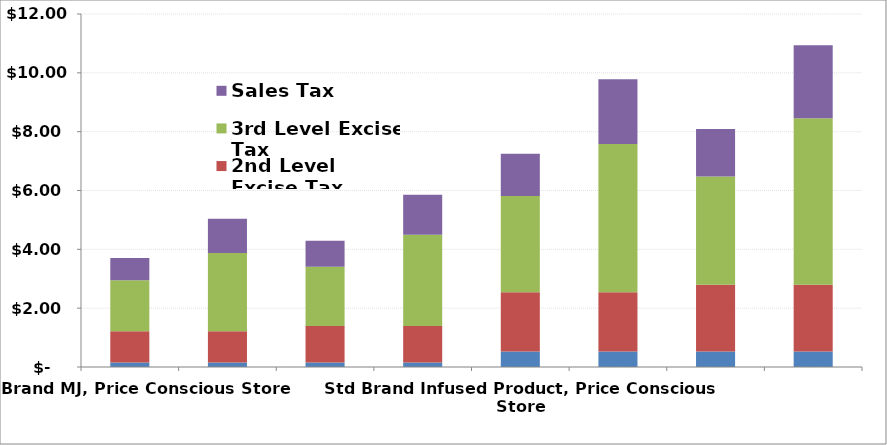
| Category | 1st Level Excise Tax | 2nd Level Excise Tax | 3rd Level Excise Tax | Sales Tax |
|---|---|---|---|---|
| Std Brand MJ, Price Conscious Store | 0.15 | 1.065 | 1.731 | 0.757 |
| Std Brand MJ, High-Touch Store | 0.15 | 1.065 | 2.662 | 1.165 |
| Prestige Brand MJ, Price Conscious Store | 0.15 | 1.242 | 2.019 | 0.883 |
| Prestige Brand MJ, High-Touch Store | 0.15 | 1.242 | 3.106 | 1.359 |
| Std Brand Infused Product, Price Conscious Store | 0.525 | 2.015 | 3.274 | 1.433 |
| Std Brand Infused Product, High-Touch Store | 0.525 | 2.015 | 5.038 | 2.204 |
| Prestige Brand Infused Product, Price Conscious Store | 0.525 | 2.267 | 3.684 | 1.612 |
| Prestige Brand Infused Product, High-Touch Store | 0.525 | 2.267 | 5.667 | 2.479 |